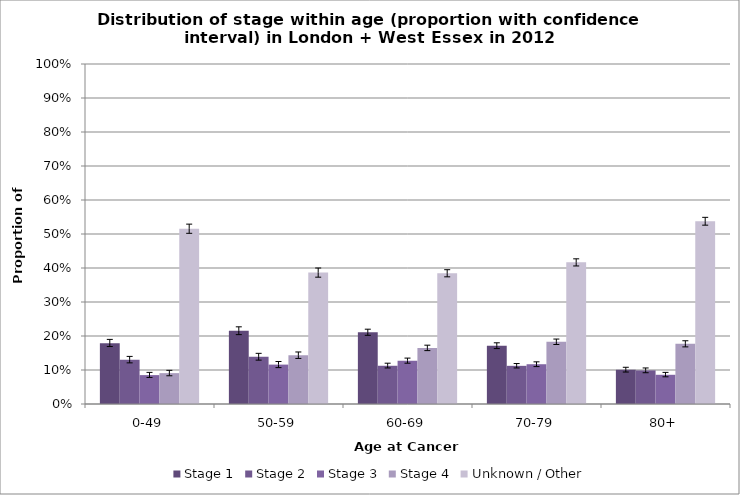
| Category | Stage 1 | Stage 2 | Stage 3 | Stage 4 | Unknown / Other |
|---|---|---|---|---|---|
| 0-49 | 0.179 | 0.13 | 0.085 | 0.091 | 0.515 |
| 50-59 | 0.216 | 0.139 | 0.116 | 0.143 | 0.387 |
| 60-69 | 0.211 | 0.112 | 0.128 | 0.165 | 0.385 |
| 70-79 | 0.171 | 0.112 | 0.117 | 0.183 | 0.417 |
| 80+ | 0.101 | 0.099 | 0.086 | 0.177 | 0.538 |